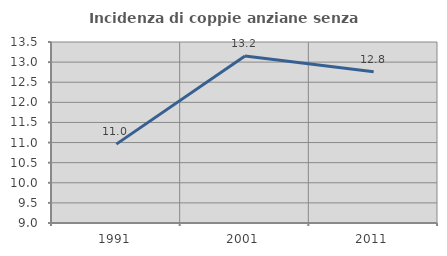
| Category | Incidenza di coppie anziane senza figli  |
|---|---|
| 1991.0 | 10.961 |
| 2001.0 | 13.151 |
| 2011.0 | 12.759 |